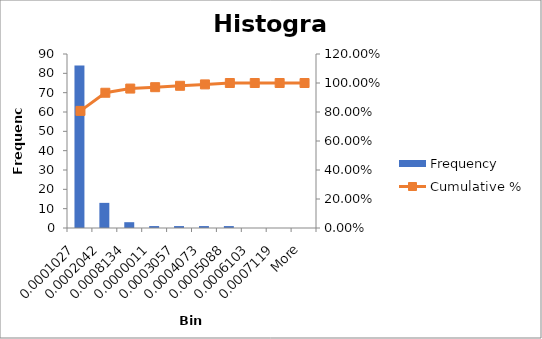
| Category | Frequency |
|---|---|
| 0.0001027 | 84 |
| 0.0002042 | 13 |
| 0.0008134 | 3 |
| 0.0000011 | 1 |
| 0.0003057 | 1 |
| 0.0004073 | 1 |
| 0.0005088 | 1 |
| 0.0006103 | 0 |
| 0.0007119 | 0 |
| More | 0 |